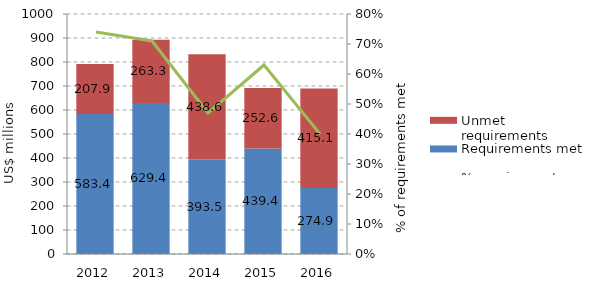
| Category | Requirements met | Unmet requirements |
|---|---|---|
| 2012.0 | 583.432 | 207.899 |
| 2013.0 | 629.382 | 263.262 |
| 2014.0 | 393.479 | 438.618 |
| 2015.0 | 439.38 | 252.62 |
| 2016.0 | 274.907 | 415.093 |